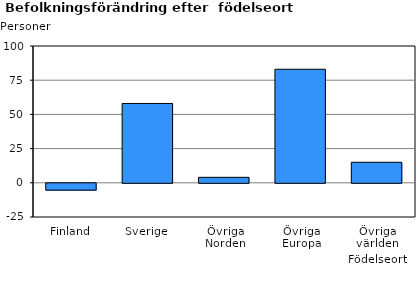
| Category | - |
|---|---|
| Finland | -5 |
| Sverige | 58 |
| Övriga Norden | 4 |
| Övriga Europa | 83 |
| Övriga världen | 15 |